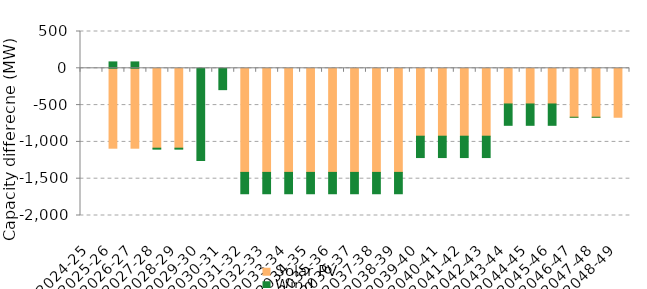
| Category | Solar PV | Wind | Offshore wind |
|---|---|---|---|
| 2024-25 | 0 | 0 | 0 |
| 2025-26 | -1085.571 | 86.869 | 0 |
| 2026-27 | -1085.571 | 86.869 | 0 |
| 2027-28 | -1085.571 | -13.044 | 0 |
| 2028-29 | -1085.571 | -13.044 | 0 |
| 2029-30 | 0 | -1253.127 | 0 |
| 2030-31 | 0 | -290.072 | 0 |
| 2031-32 | -1414.349 | -290.072 | 0 |
| 2032-33 | -1414.349 | -290.072 | 0 |
| 2033-34 | -1414.349 | -290.072 | 0 |
| 2034-35 | -1414.349 | -290.072 | 0 |
| 2035-36 | -1414.349 | -290.072 | 0 |
| 2036-37 | -1414.349 | -290.072 | 0 |
| 2037-38 | -1414.349 | -290.072 | 0 |
| 2038-39 | -1414.349 | -290.072 | 0 |
| 2039-40 | -922.622 | -290.072 | 0 |
| 2040-41 | -922.622 | -290.072 | 0 |
| 2041-42 | -922.622 | -290.072 | 0 |
| 2042-43 | -922.622 | -290.072 | 0 |
| 2043-44 | -484.579 | -290.072 | 0 |
| 2044-45 | -484.579 | -290.072 | 0 |
| 2045-46 | -484.579 | -290.072 | 0 |
| 2046-47 | -664.934 | 0 | 0 |
| 2047-48 | -664.934 | 0 | 0 |
| 2048-49 | -664.934 | 0 | 0 |